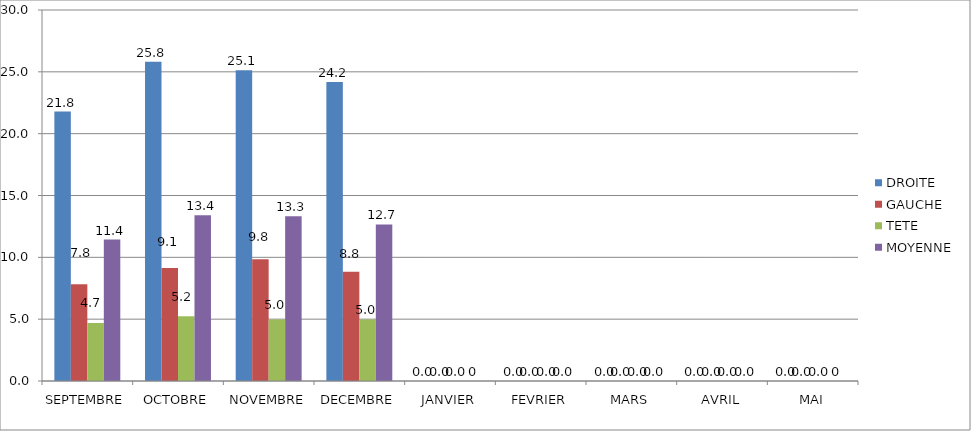
| Category | DROITE | GAUCHE | TETE | MOYENNE |
|---|---|---|---|---|
| SEPTEMBRE | 21.787 | 7.833 | 4.7 | 11.44 |
| OCTOBRE | 25.818 | 9.136 | 5.236 | 13.397 |
| NOVEMBRE | 25.126 | 9.844 | 4.97 | 13.314 |
| DECEMBRE | 24.174 | 8.826 | 4.978 | 12.659 |
| JANVIER | 0 | 0 | 0 | 0 |
| FEVRIER | 0 | 0 | 0 | 0 |
| MARS | 0 | 0 | 0 | 0 |
| AVRIL | 0 | 0 | 0 | 0 |
| MAI | 0 | 0 | 0 | 0 |